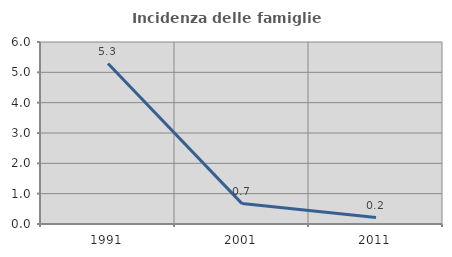
| Category | Incidenza delle famiglie numerose |
|---|---|
| 1991.0 | 5.29 |
| 2001.0 | 0.673 |
| 2011.0 | 0.212 |